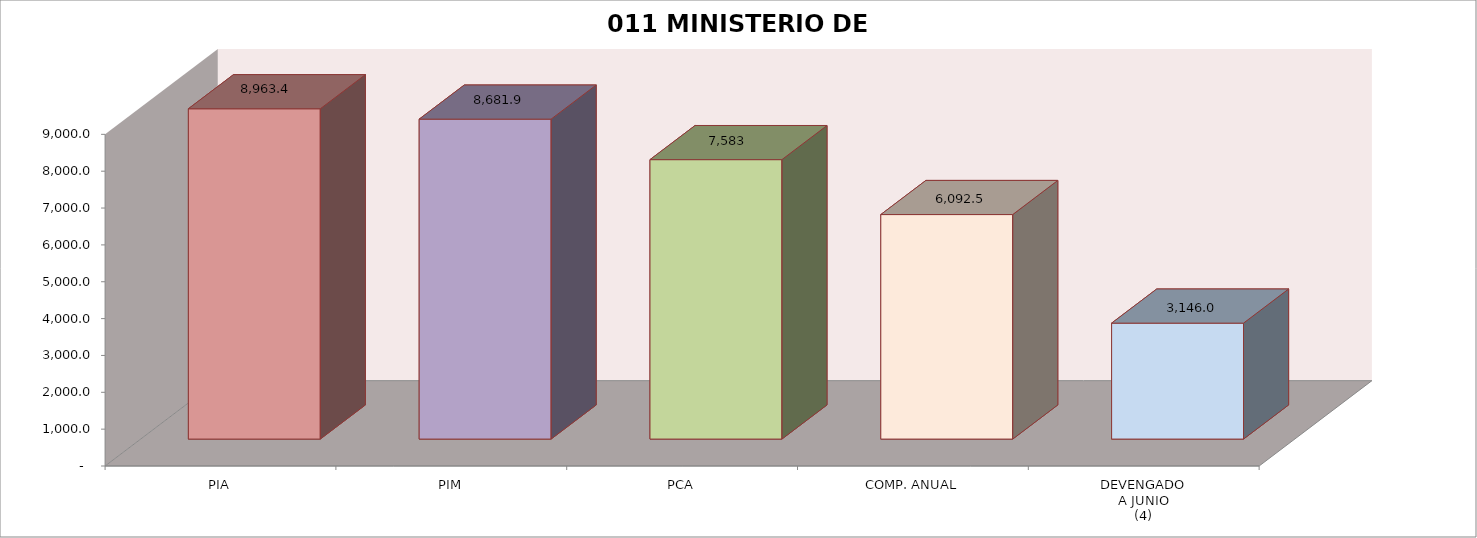
| Category | 011 MINISTERIO DE SALUD |
|---|---|
| PIA | 8963.39 |
| PIM | 8681.939 |
| PCA | 7582.883 |
| COMP. ANUAL | 6092.533 |
| DEVENGADO
A JUNIO
(4) | 3146.017 |